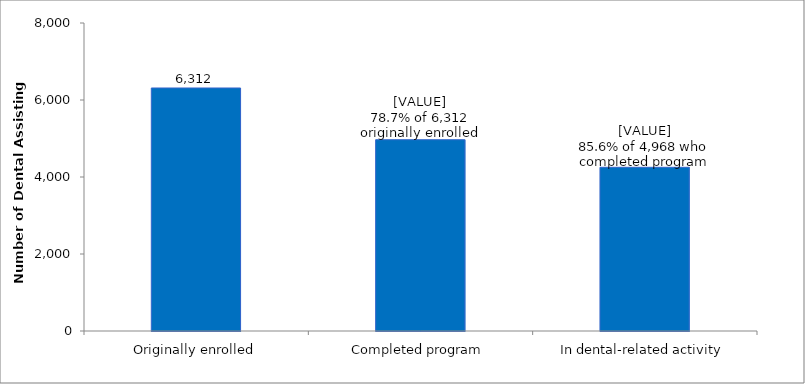
| Category | Series 0 |
|---|---|
| Originally enrolled | 6312 |
| Completed program | 4968 |
| In dental-related activity | 4252 |